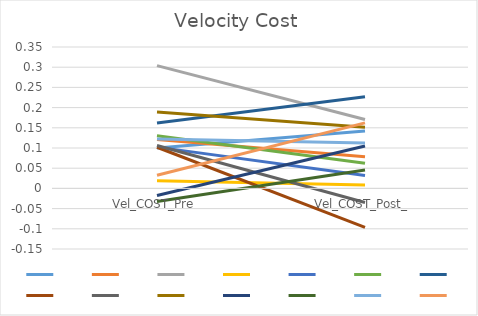
| Category | Series 0 | Series 1 | Series 2 | Series 3 | Series 4 | Series 5 | Series 6 | Series 7 | Series 8 | Series 9 | Series 10 | Series 11 | Series 12 | Series 13 |
|---|---|---|---|---|---|---|---|---|---|---|---|---|---|---|
| Vel_COST_Pre | 0.1 | 0.121 | 0.304 | 0.019 | 0.102 | 0.131 | 0.162 | 0.102 | 0.106 | 0.189 | -0.018 | -0.032 | 0.122 | 0.033 |
| Vel_COST_Post_ | 0.142 | 0.078 | 0.171 | 0.009 | 0.032 | 0.062 | 0.227 | -0.096 | -0.035 | 0.152 | 0.105 | 0.045 | 0.112 | 0.162 |